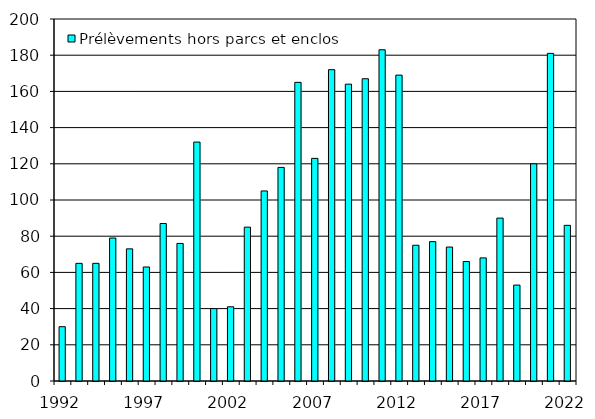
| Category | Prélèvements hors parcs et enclos |
|---|---|
| 1992.0 | 30 |
| 1993.0 | 65 |
| 1994.0 | 65 |
| 1995.0 | 79 |
| 1996.0 | 73 |
| 1997.0 | 63 |
| 1998.0 | 87 |
| 1999.0 | 76 |
| 2000.0 | 132 |
| 2001.0 | 40 |
| 2002.0 | 41 |
| 2003.0 | 85 |
| 2004.0 | 105 |
| 2005.0 | 118 |
| 2006.0 | 165 |
| 2007.0 | 123 |
| 2008.0 | 172 |
| 2009.0 | 164 |
| 2010.0 | 167 |
| 2011.0 | 183 |
| 2012.0 | 169 |
| 2013.0 | 75 |
| 2014.0 | 77 |
| 2015.0 | 74 |
| 2016.0 | 66 |
| 2017.0 | 68 |
| 2018.0 | 90 |
| 2019.0 | 53 |
| 2020.0 | 120 |
| 2021.0 | 181 |
| 2022.0 | 86 |